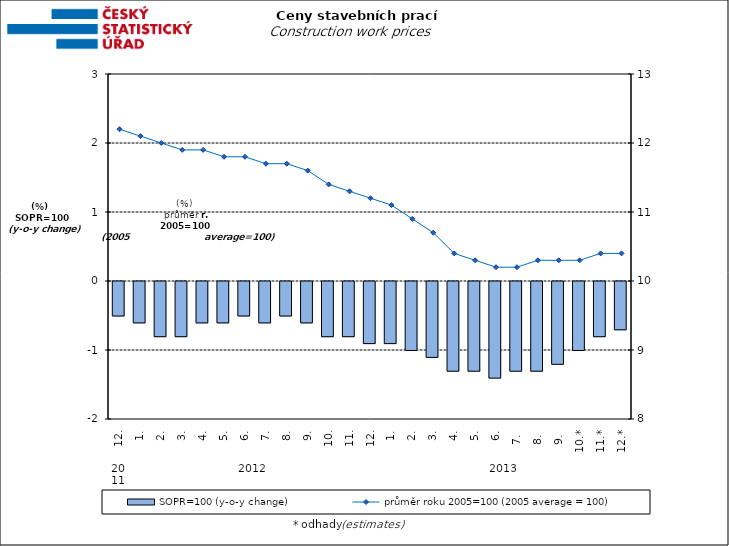
| Category | SOPR=100 (y-o-y change)   |
|---|---|
| 0 | -0.5 |
| 1 | -0.6 |
| 2 | -0.8 |
| 3 | -0.8 |
| 4 | -0.6 |
| 5 | -0.6 |
| 6 | -0.5 |
| 7 | -0.6 |
| 8 | -0.5 |
| 9 | -0.6 |
| 10 | -0.8 |
| 11 | -0.8 |
| 12 | -0.9 |
| 13 | -0.9 |
| 14 | -1 |
| 15 | -1.1 |
| 16 | -1.3 |
| 17 | -1.3 |
| 18 | -1.4 |
| 19 | -1.3 |
| 20 | -1.3 |
| 21 | -1.2 |
| 22 | -1 |
| 23 | -0.8 |
| 24 | -0.7 |